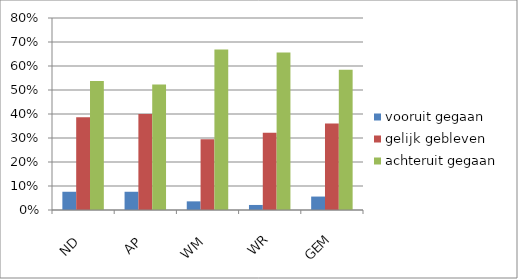
| Category | vooruit gegaan | gelijk gebleven | achteruit gegaan |
|---|---|---|---|
| ND | 0.076 | 0.386 | 0.538 |
| AP | 0.076 | 0.4 | 0.523 |
| WM | 0.036 | 0.295 | 0.669 |
| WR | 0.021 | 0.322 | 0.656 |
| GEM | 0.056 | 0.36 | 0.584 |